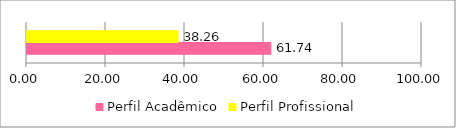
| Category | Perfil Acadêmico | Perfil Profissional |
|---|---|---|
| 0 | 61.745 | 38.255 |